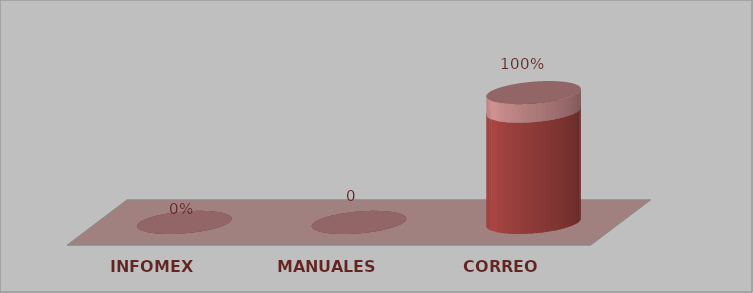
| Category | Series 0 | Series 1 |
|---|---|---|
| INFOMEX | 0 | 0 |
| MANUALES | 0 | 0 |
| CORREO | 6 | 1 |